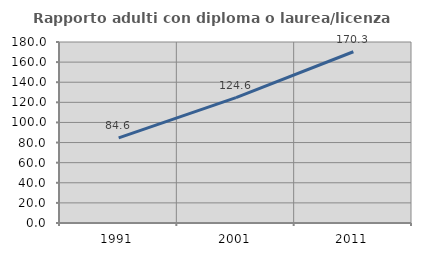
| Category | Rapporto adulti con diploma o laurea/licenza media  |
|---|---|
| 1991.0 | 84.615 |
| 2001.0 | 124.638 |
| 2011.0 | 170.312 |